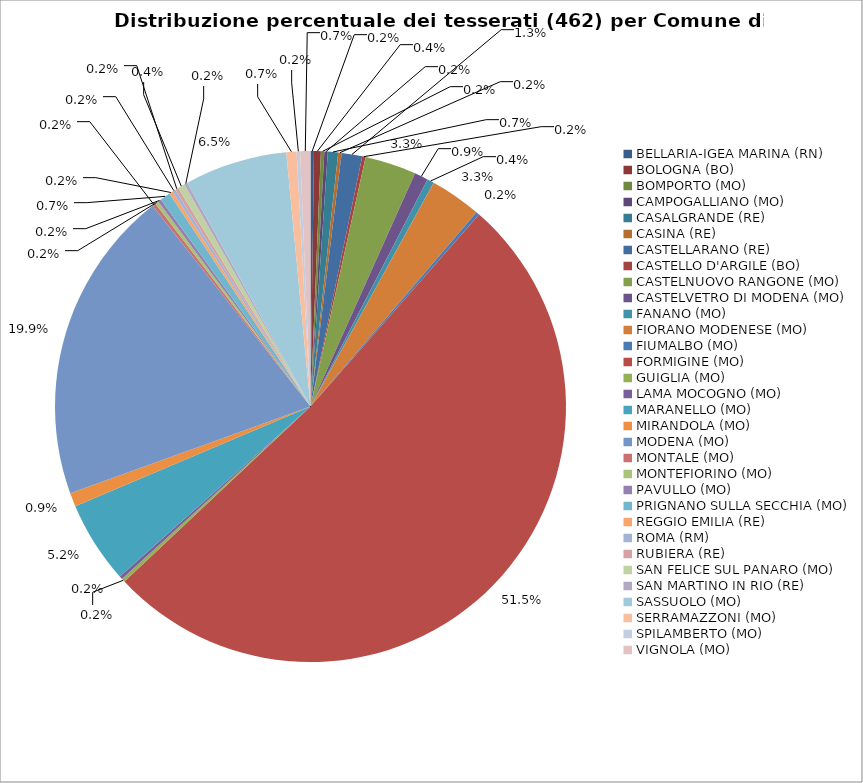
| Category | Nr. Tesserati |
|---|---|
| BELLARIA-IGEA MARINA (RN) | 1 |
| BOLOGNA (BO) | 2 |
| BOMPORTO (MO) | 1 |
| CAMPOGALLIANO (MO) | 1 |
| CASALGRANDE (RE) | 3 |
| CASINA (RE) | 1 |
| CASTELLARANO (RE) | 6 |
| CASTELLO D'ARGILE (BO) | 1 |
| CASTELNUOVO RANGONE (MO) | 15 |
| CASTELVETRO DI MODENA (MO) | 4 |
| FANANO (MO) | 2 |
| FIORANO MODENESE (MO) | 15 |
| FIUMALBO (MO) | 1 |
| FORMIGINE (MO) | 238 |
| GUIGLIA (MO) | 1 |
| LAMA MOCOGNO (MO) | 1 |
| MARANELLO (MO) | 24 |
| MIRANDOLA (MO) | 4 |
| MODENA (MO) | 92 |
| MONTALE (MO) | 1 |
| MONTEFIORINO (MO) | 1 |
| PAVULLO (MO) | 1 |
| PRIGNANO SULLA SECCHIA (MO) | 3 |
| REGGIO EMILIA (RE) | 1 |
| ROMA (RM) | 1 |
| RUBIERA (RE) | 1 |
| SAN FELICE SUL PANARO (MO) | 2 |
| SAN MARTINO IN RIO (RE) | 1 |
| SASSUOLO (MO) | 30 |
| SERRAMAZZONI (MO) | 3 |
| SPILAMBERTO (MO) | 1 |
| VIGNOLA (MO) | 3 |